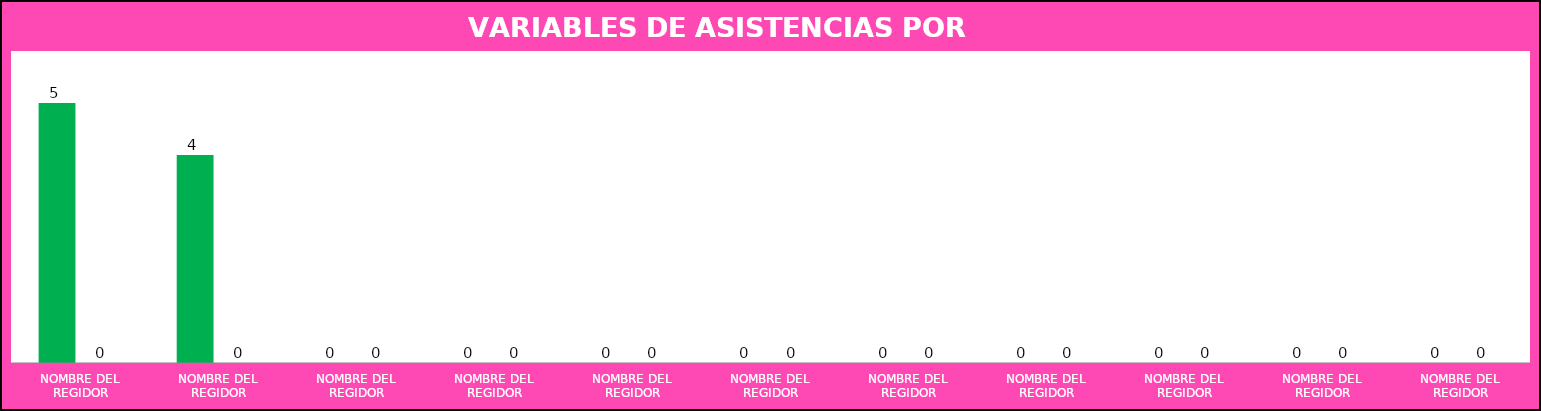
| Category | Series 0 | Series 1 |
|---|---|---|
| NOMBRE DEL REGIDOR | 5 | 0 |
| NOMBRE DEL REGIDOR | 4 | 0 |
| NOMBRE DEL REGIDOR | 0 | 0 |
| NOMBRE DEL REGIDOR | 0 | 0 |
| NOMBRE DEL REGIDOR | 0 | 0 |
| NOMBRE DEL REGIDOR | 0 | 0 |
| NOMBRE DEL REGIDOR | 0 | 0 |
| NOMBRE DEL REGIDOR | 0 | 0 |
| NOMBRE DEL REGIDOR | 0 | 0 |
| NOMBRE DEL REGIDOR | 0 | 0 |
| NOMBRE DEL REGIDOR | 0 | 0 |